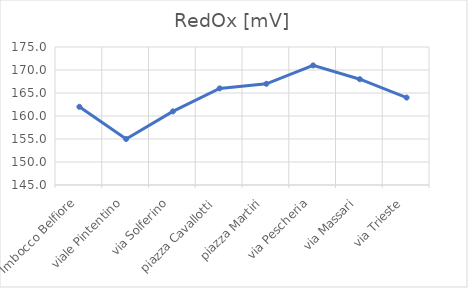
| Category | RedOx [mV] |
|---|---|
| Imbocco Belfiore | 162 |
| viale Pintentino | 155 |
| via Solferino | 161 |
| piazza Cavallotti | 166 |
| piazza Martiri | 167 |
| via Pescheria | 171 |
| via Massari | 168 |
| via Trieste | 164 |